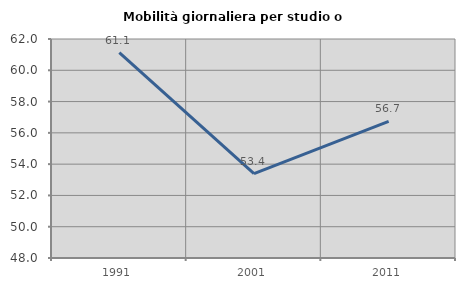
| Category | Mobilità giornaliera per studio o lavoro |
|---|---|
| 1991.0 | 61.134 |
| 2001.0 | 53.391 |
| 2011.0 | 56.735 |